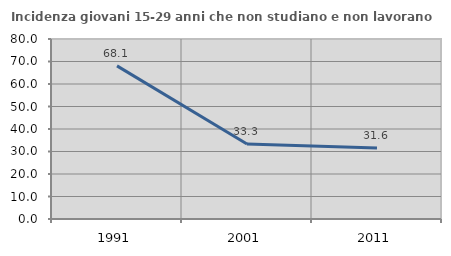
| Category | Incidenza giovani 15-29 anni che non studiano e non lavorano  |
|---|---|
| 1991.0 | 68.06 |
| 2001.0 | 33.333 |
| 2011.0 | 31.579 |